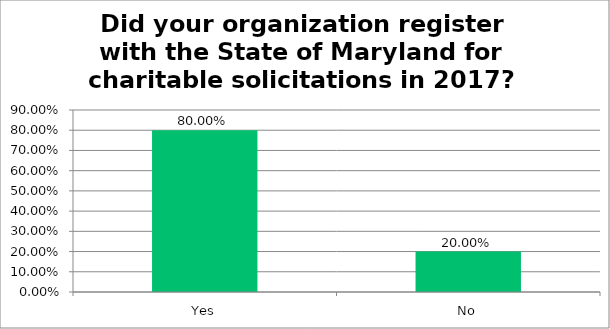
| Category | Responses |
|---|---|
| Yes | 0.8 |
| No | 0.2 |